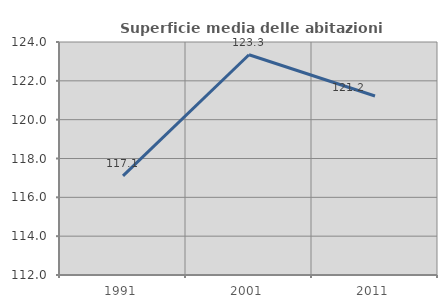
| Category | Superficie media delle abitazioni occupate |
|---|---|
| 1991.0 | 117.102 |
| 2001.0 | 123.345 |
| 2011.0 | 121.221 |